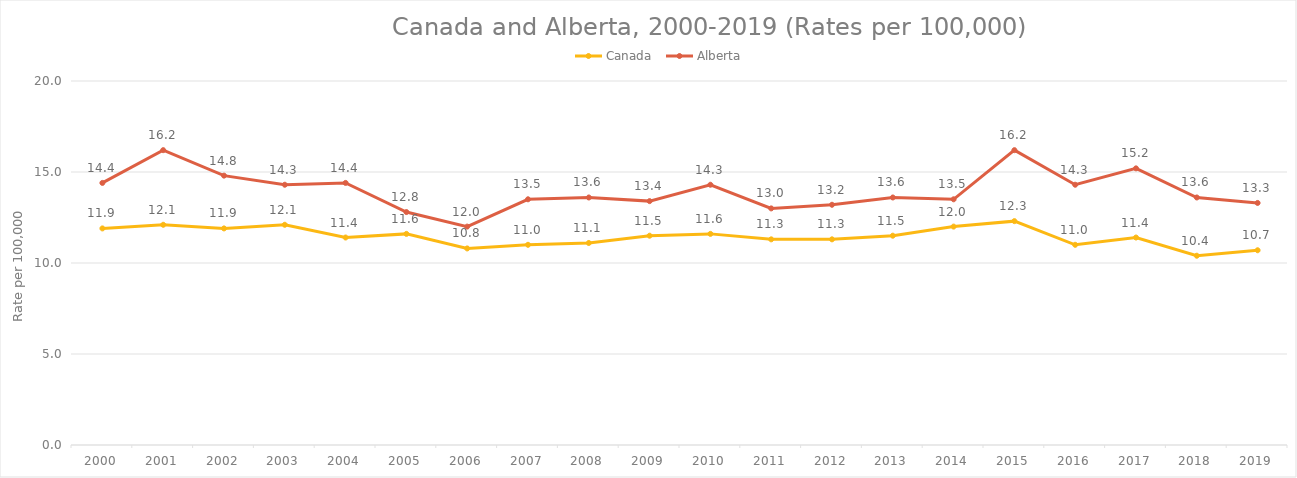
| Category | Canada  | Alberta |
|---|---|---|
| 2000.0 | 11.9 | 14.4 |
| 2001.0 | 12.1 | 16.2 |
| 2002.0 | 11.9 | 14.8 |
| 2003.0 | 12.1 | 14.3 |
| 2004.0 | 11.4 | 14.4 |
| 2005.0 | 11.6 | 12.8 |
| 2006.0 | 10.8 | 12 |
| 2007.0 | 11 | 13.5 |
| 2008.0 | 11.1 | 13.6 |
| 2009.0 | 11.5 | 13.4 |
| 2010.0 | 11.6 | 14.3 |
| 2011.0 | 11.3 | 13 |
| 2012.0 | 11.3 | 13.2 |
| 2013.0 | 11.5 | 13.6 |
| 2014.0 | 12 | 13.5 |
| 2015.0 | 12.3 | 16.2 |
| 2016.0 | 11 | 14.3 |
| 2017.0 | 11.4 | 15.2 |
| 2018.0 | 10.4 | 13.6 |
| 2019.0 | 10.7 | 13.3 |